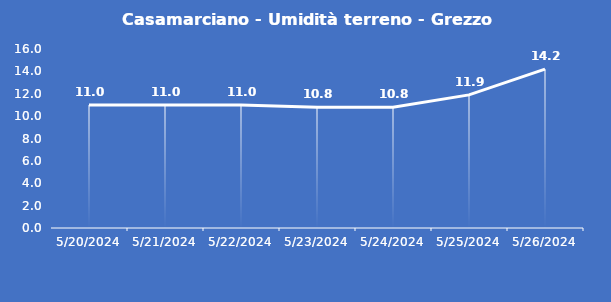
| Category | Casamarciano - Umidità terreno - Grezzo (%VWC) |
|---|---|
| 5/20/24 | 11 |
| 5/21/24 | 11 |
| 5/22/24 | 11 |
| 5/23/24 | 10.8 |
| 5/24/24 | 10.8 |
| 5/25/24 | 11.9 |
| 5/26/24 | 14.2 |